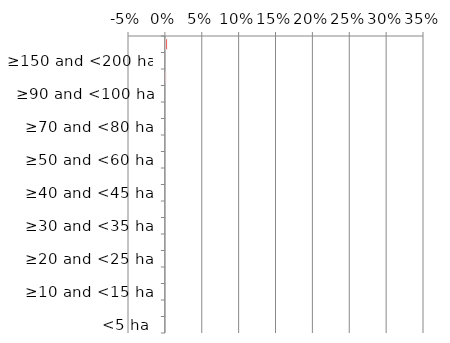
| Category | Not determinable |
|---|---|
| <5 ha | 0 |
| ≥5 and <10 ha | 0 |
| ≥10 and <15 ha | 0 |
| ≥15 and <20 ha | 0 |
| ≥20 and <25 ha | 0 |
| ≥25 and <30 ha | 0 |
| ≥30 and <35 ha | 0 |
| ≥35 and <40 ha | 0 |
| ≥40 and <45 ha | 0 |
| ≥45 and <50 ha | 0 |
| ≥50 and <60 ha | 0 |
| ≥60 and <70 ha | 0 |
| ≥70 and <80 ha | 0 |
| ≥80 and <90 ha | 0 |
| ≥90 and <100 ha | 0 |
| ≥100 and <150 ha | 0 |
| ≥150 and <200 ha | 0 |
| ≥200 ha | 0.002 |